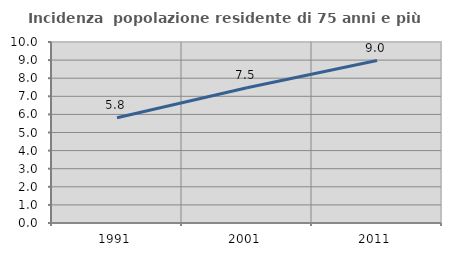
| Category | Incidenza  popolazione residente di 75 anni e più |
|---|---|
| 1991.0 | 5.817 |
| 2001.0 | 7.469 |
| 2011.0 | 8.975 |